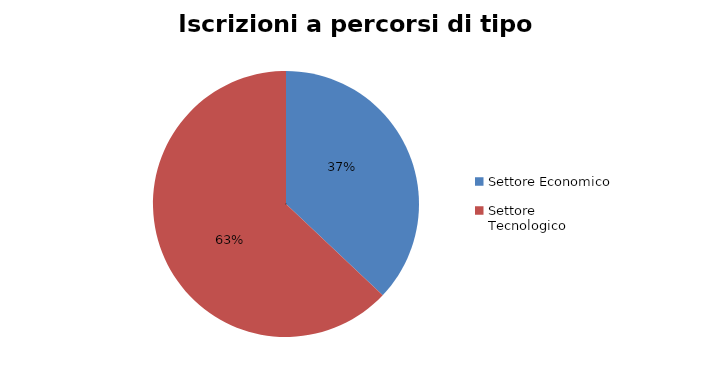
| Category | Series 0 |
|---|---|
| Settore Economico | 4997 |
| Settore Tecnologico | 8493 |